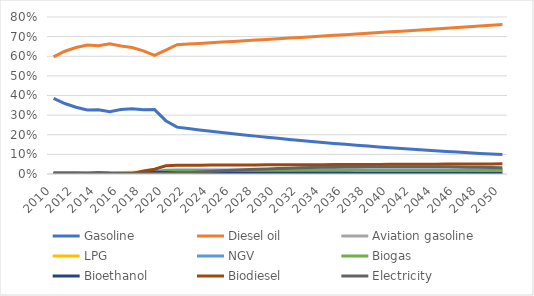
| Category | Gasoline | Diesel oil | Aviation gasoline | LPG | NGV | Biogas | Bioethanol | Biodiesel | Electricity |
|---|---|---|---|---|---|---|---|---|---|
| 2010.0 | 0.385 | 0.596 | 0.001 | 0.003 | 0 | 0 | 0.005 | 0.004 | 0.004 |
| 2011.0 | 0.359 | 0.625 | 0.002 | 0.003 | 0 | 0 | 0.005 | 0.001 | 0.004 |
| 2012.0 | 0.34 | 0.644 | 0.001 | 0.004 | 0.001 | 0 | 0.005 | 0 | 0.004 |
| 2013.0 | 0.327 | 0.657 | 0.002 | 0.005 | 0.001 | 0 | 0.004 | 0 | 0.004 |
| 2014.0 | 0.327 | 0.653 | 0.002 | 0.006 | 0.002 | 0 | 0.007 | 0 | 0.003 |
| 2015.0 | 0.317 | 0.663 | 0.002 | 0.007 | 0.004 | 0 | 0.004 | 0 | 0.003 |
| 2016.0 | 0.328 | 0.652 | 0.001 | 0.008 | 0.005 | 0 | 0.002 | 0 | 0.003 |
| 2017.0 | 0.333 | 0.645 | 0.002 | 0.009 | 0.006 | 0 | 0.001 | 0.002 | 0.003 |
| 2018.0 | 0.328 | 0.628 | 0.002 | 0.011 | 0.009 | 0 | 0.006 | 0.015 | 0.003 |
| 2019.0 | 0.328 | 0.604 | 0.002 | 0.013 | 0.011 | 0.006 | 0.009 | 0.024 | 0.003 |
| 2020.0 | 0.272 | 0.632 | 0.002 | 0.013 | 0.02 | 0.011 | 0.008 | 0.041 | 0.003 |
| 2021.0 | 0.239 | 0.659 | 0.002 | 0.012 | 0.021 | 0.014 | 0.005 | 0.045 | 0.003 |
| 2022.0 | 0.232 | 0.662 | 0.002 | 0.012 | 0.021 | 0.014 | 0.005 | 0.045 | 0.007 |
| 2023.0 | 0.225 | 0.665 | 0.002 | 0.012 | 0.021 | 0.014 | 0.005 | 0.045 | 0.01 |
| 2024.0 | 0.218 | 0.669 | 0.002 | 0.012 | 0.021 | 0.015 | 0.005 | 0.045 | 0.013 |
| 2025.0 | 0.211 | 0.672 | 0.002 | 0.012 | 0.021 | 0.015 | 0.004 | 0.046 | 0.016 |
| 2026.0 | 0.205 | 0.675 | 0.002 | 0.012 | 0.021 | 0.015 | 0.004 | 0.046 | 0.019 |
| 2027.0 | 0.199 | 0.679 | 0.002 | 0.012 | 0.021 | 0.015 | 0.004 | 0.046 | 0.022 |
| 2028.0 | 0.193 | 0.682 | 0.002 | 0.012 | 0.021 | 0.015 | 0.004 | 0.046 | 0.024 |
| 2029.0 | 0.187 | 0.686 | 0.002 | 0.012 | 0.021 | 0.015 | 0.004 | 0.047 | 0.026 |
| 2030.0 | 0.182 | 0.689 | 0.002 | 0.012 | 0.021 | 0.015 | 0.004 | 0.047 | 0.028 |
| 2031.0 | 0.176 | 0.693 | 0.002 | 0.012 | 0.021 | 0.016 | 0.004 | 0.047 | 0.03 |
| 2032.0 | 0.171 | 0.696 | 0.002 | 0.012 | 0.021 | 0.016 | 0.004 | 0.047 | 0.031 |
| 2033.0 | 0.166 | 0.699 | 0.002 | 0.012 | 0.021 | 0.016 | 0.004 | 0.047 | 0.033 |
| 2034.0 | 0.161 | 0.703 | 0.002 | 0.012 | 0.021 | 0.016 | 0.003 | 0.048 | 0.034 |
| 2035.0 | 0.156 | 0.706 | 0.002 | 0.012 | 0.021 | 0.016 | 0.003 | 0.048 | 0.035 |
| 2036.0 | 0.151 | 0.71 | 0.002 | 0.012 | 0.021 | 0.016 | 0.003 | 0.048 | 0.036 |
| 2037.0 | 0.147 | 0.714 | 0.002 | 0.012 | 0.021 | 0.017 | 0.003 | 0.048 | 0.036 |
| 2038.0 | 0.142 | 0.717 | 0.002 | 0.012 | 0.021 | 0.017 | 0.003 | 0.049 | 0.037 |
| 2039.0 | 0.138 | 0.721 | 0.002 | 0.012 | 0.021 | 0.017 | 0.003 | 0.049 | 0.037 |
| 2040.0 | 0.134 | 0.724 | 0.002 | 0.012 | 0.021 | 0.017 | 0.003 | 0.049 | 0.037 |
| 2041.0 | 0.13 | 0.728 | 0.002 | 0.012 | 0.021 | 0.017 | 0.003 | 0.049 | 0.037 |
| 2042.0 | 0.126 | 0.732 | 0.002 | 0.012 | 0.021 | 0.017 | 0.003 | 0.05 | 0.037 |
| 2043.0 | 0.122 | 0.735 | 0.002 | 0.012 | 0.021 | 0.018 | 0.003 | 0.05 | 0.037 |
| 2044.0 | 0.119 | 0.739 | 0.002 | 0.012 | 0.021 | 0.018 | 0.003 | 0.05 | 0.037 |
| 2045.0 | 0.115 | 0.743 | 0.002 | 0.012 | 0.021 | 0.018 | 0.002 | 0.05 | 0.036 |
| 2046.0 | 0.112 | 0.746 | 0.002 | 0.012 | 0.021 | 0.018 | 0.002 | 0.051 | 0.036 |
| 2047.0 | 0.108 | 0.75 | 0.002 | 0.012 | 0.021 | 0.018 | 0.002 | 0.051 | 0.035 |
| 2048.0 | 0.105 | 0.754 | 0.002 | 0.012 | 0.021 | 0.019 | 0.002 | 0.051 | 0.034 |
| 2049.0 | 0.102 | 0.758 | 0.002 | 0.012 | 0.021 | 0.019 | 0.002 | 0.051 | 0.033 |
| 2050.0 | 0.099 | 0.761 | 0.002 | 0.012 | 0.021 | 0.019 | 0.002 | 0.052 | 0.032 |